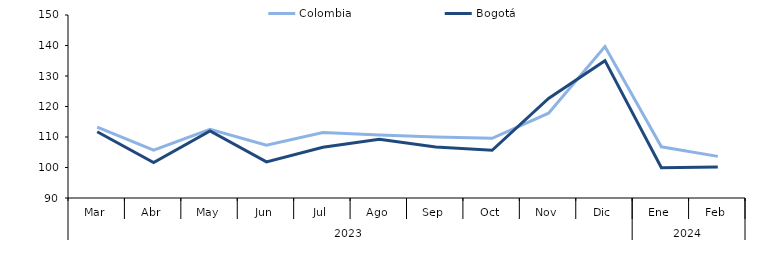
| Category | Colombia | Bogotá |
|---|---|---|
| 0 | 113.259 | 111.724 |
| 1 | 105.717 | 101.644 |
| 2 | 112.508 | 111.968 |
| 3 | 107.304 | 101.847 |
| 4 | 111.437 | 106.624 |
| 5 | 110.639 | 109.251 |
| 6 | 110.039 | 106.746 |
| 7 | 109.57 | 105.654 |
| 8 | 117.796 | 122.653 |
| 9 | 139.674 | 135.034 |
| 10 | 106.776 | 99.899 |
| 11 | 103.651 | 100.181 |